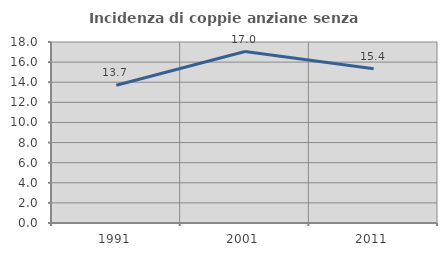
| Category | Incidenza di coppie anziane senza figli  |
|---|---|
| 1991.0 | 13.703 |
| 2001.0 | 17.048 |
| 2011.0 | 15.351 |